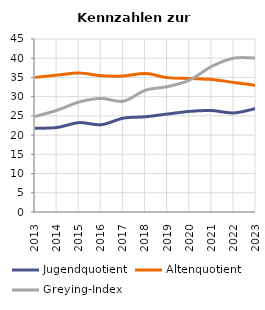
| Category | Jugendquotient | Altenquotient | Greying-Index |
|---|---|---|---|
| 2013.0 | 21.776 | 35.017 | 24.841 |
| 2014.0 | 21.987 | 35.603 | 26.464 |
| 2015.0 | 23.247 | 36.131 | 28.618 |
| 2016.0 | 22.703 | 35.444 | 29.543 |
| 2017.0 | 24.412 | 35.403 | 28.812 |
| 2018.0 | 24.779 | 36.014 | 31.674 |
| 2019.0 | 25.49 | 34.955 | 32.614 |
| 2020.0 | 26.17 | 34.73 | 34.33 |
| 2021.0 | 26.395 | 34.481 | 37.886 |
| 2022.0 | 25.77 | 33.7 | 40.02 |
| 2023.0 | 26.933 | 32.906 | 40.024 |